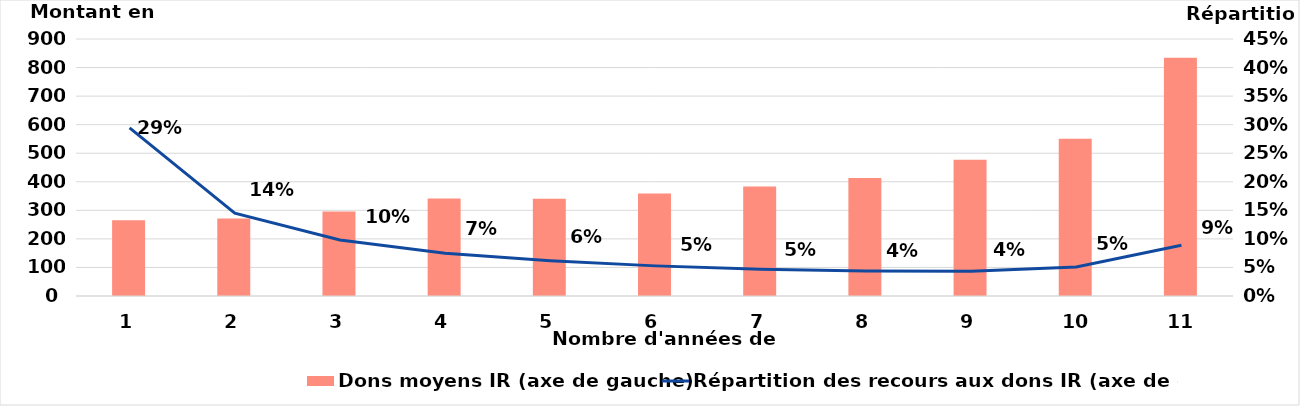
| Category | Dons moyens IR (axe de gauche) |
|---|---|
| 1.0 | 265.274 |
| 2.0 | 271.214 |
| 3.0 | 296.145 |
| 4.0 | 341.486 |
| 5.0 | 340.553 |
| 6.0 | 359.056 |
| 7.0 | 383.289 |
| 8.0 | 413.245 |
| 9.0 | 477.331 |
| 10.0 | 550.277 |
| 11.0 | 834.228 |